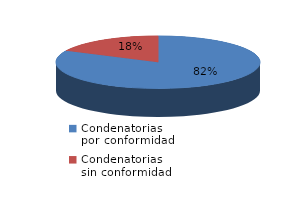
| Category | Series 0 |
|---|---|
| 0 | 69 |
| 1 | 15 |